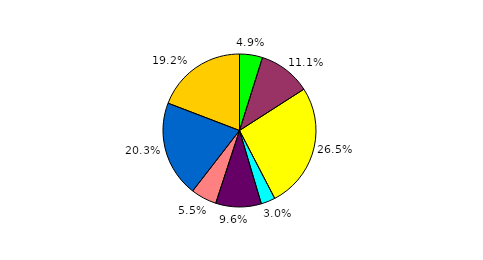
| Category | Series 0 |
|---|---|
| 0 | 4.856 |
| 1 | 11.067 |
| 2 | 26.46 |
| 3 | 3.008 |
| 4 | 9.632 |
| 5 | 5.465 |
| 6 | 20.326 |
| 7 | 19.186 |